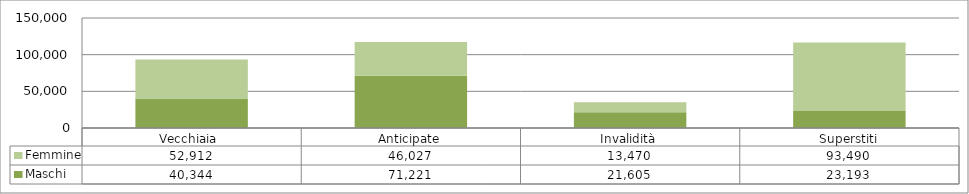
| Category | Maschi | Femmine |
|---|---|---|
| Vecchiaia  | 40344 | 52912 |
| Anticipate | 71221 | 46027 |
| Invalidità | 21605 | 13470 |
| Superstiti | 23193 | 93490 |